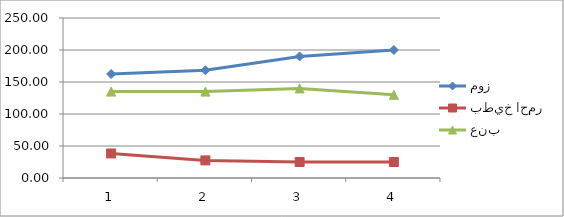
| Category | موز | بطيخ احمر | عنب |
|---|---|---|---|
| 0 | 162.5 | 38.33 | 135 |
| 1 | 168.33 | 27.5 | 135 |
| 2 | 190 | 25 | 140 |
| 3 | 200 | 25 | 130 |